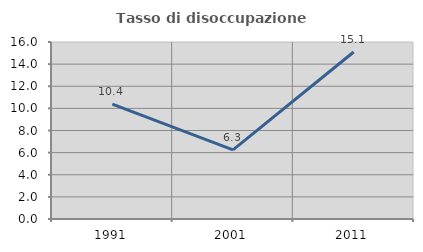
| Category | Tasso di disoccupazione giovanile  |
|---|---|
| 1991.0 | 10.377 |
| 2001.0 | 6.25 |
| 2011.0 | 15.094 |